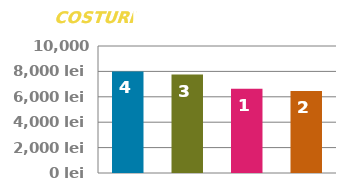
| Category | ÎN AVANS |
|---|---|
| 0 | 8000 |
| 1 | 7750 |
| 2 | 6625 |
| 3 | 6450 |